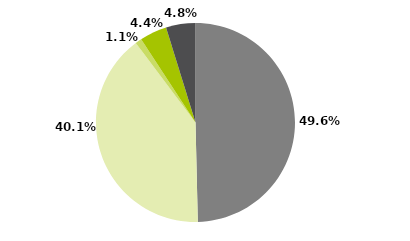
| Category | Series 0 |
|---|---|
| Multimercados Macro | 0.496 |
| Multimercados Livre | 0.401 |
| Multimercados L/S - Neutro | 0.01 |
| Multimercados L/S - Direcional | 0.044 |
| Outros | 0.048 |